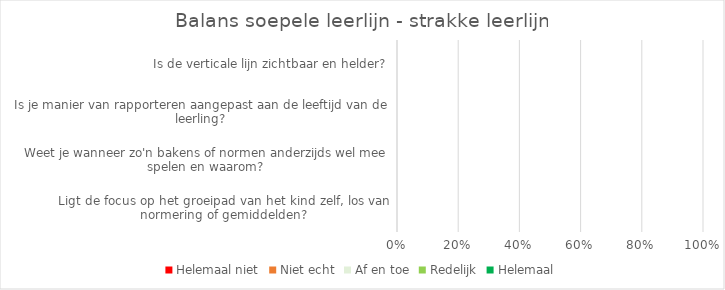
| Category | Helemaal niet | Niet echt | Af en toe | Redelijk | Helemaal |
|---|---|---|---|---|---|
| Ligt de focus op het groeipad van het kind zelf, los van normering of gemiddelden? | 0 | 0 | 0 | 0 | 0 |
| Weet je wanneer zo'n bakens of normen anderzijds wel mee spelen en waarom? | 0 | 0 | 0 | 0 | 0 |
| Is je manier van rapporteren aangepast aan de leeftijd van de leerling? | 0 | 0 | 0 | 0 | 0 |
| Is de verticale lijn zichtbaar en helder? | 0 | 0 | 0 | 0 | 0 |